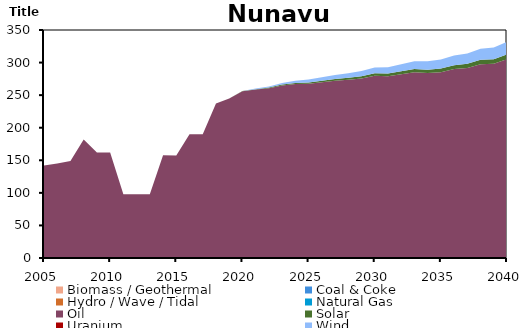
| Category | Biomass / Geothermal | Coal & Coke | Hydro / Wave / Tidal | Natural Gas | Oil | Solar | Uranium | Wind |
|---|---|---|---|---|---|---|---|---|
| 2005.0 | 0 | 0 | 0 | 0 | 142 | 0 | 0 | 0 |
| 2006.0 | 0 | 0 | 0 | 0 | 145 | 0 | 0 | 0 |
| 2007.0 | 0 | 0 | 0 | 0 | 149 | 0 | 0 | 0 |
| 2008.0 | 0 | 0 | 0 | 0 | 182 | 0 | 0 | 0 |
| 2009.0 | 0 | 0 | 0 | 0 | 162 | 0 | 0 | 0 |
| 2010.0 | 0 | 0 | 0 | 0 | 162 | 0 | 0 | 0 |
| 2011.0 | 0 | 0 | 0 | 0 | 98 | 0 | 0 | 0 |
| 2012.0 | 0 | 0 | 0 | 0 | 98 | 0 | 0 | 0 |
| 2013.0 | 0 | 0 | 0 | 0 | 98 | 0 | 0 | 0 |
| 2014.0 | 0 | 0 | 0 | 0 | 157.598 | 0 | 0 | 0 |
| 2015.0 | 0 | 0 | 0 | 0 | 157.415 | 0 | 0 | 0 |
| 2016.0 | 0 | 0 | 0 | 0 | 189.829 | 0 | 0 | 0 |
| 2017.0 | 0 | 0 | 0 | 0 | 189.829 | 0 | 0 | 0 |
| 2018.0 | 0 | 0 | 0 | 0 | 237.248 | 0 | 0 | 0 |
| 2019.0 | 0 | 0 | 0 | 0 | 244.741 | 0 | 0 | 0 |
| 2020.0 | 0 | 0 | 0 | 0 | 255.859 | 0.35 | 0 | 0 |
| 2021.0 | 0 | 0 | 0 | 0 | 258.58 | 0.643 | 0 | 0.846 |
| 2022.0 | 0 | 0 | 0 | 0 | 260.719 | 0.956 | 0 | 1.672 |
| 2023.0 | 0 | 0 | 0 | 0 | 264.931 | 1.292 | 0 | 2.562 |
| 2024.0 | 0 | 0 | 0 | 0 | 267.011 | 1.634 | 0 | 3.462 |
| 2025.0 | 0 | 0 | 0 | 0 | 267.531 | 1.974 | 0 | 4.357 |
| 2026.0 | 0 | 0 | 0 | 0 | 269.952 | 2.321 | 0 | 5.272 |
| 2027.0 | 0 | 0 | 0 | 0 | 272.148 | 2.666 | 0 | 6.184 |
| 2028.0 | 0 | 0 | 0 | 0 | 273.535 | 3.019 | 0 | 7.116 |
| 2029.0 | 0 | 0 | 0 | 0 | 275.73 | 3.369 | 0 | 8.04 |
| 2030.0 | 0 | 0 | 0 | 0 | 279.716 | 3.729 | 0 | 8.986 |
| 2031.0 | 0 | 0 | 0 | 0 | 278.967 | 4.091 | 0 | 9.942 |
| 2032.0 | 0 | 0 | 0 | 0 | 282.137 | 4.462 | 0 | 10.921 |
| 2033.0 | 0 | 0 | 0 | 0 | 285.296 | 4.832 | 0 | 11.895 |
| 2034.0 | 0 | 0 | 0 | 0 | 283.836 | 5.21 | 0 | 12.89 |
| 2035.0 | 0 | 0 | 0 | 0 | 285.226 | 5.587 | 0 | 13.881 |
| 2036.0 | 0 | 0 | 0 | 0 | 290.049 | 5.967 | 0 | 14.899 |
| 2037.0 | 0 | 0 | 0 | 0 | 291.803 | 6.353 | 0 | 15.912 |
| 2038.0 | 0 | 0 | 0 | 0 | 297.483 | 6.745 | 0 | 16.938 |
| 2039.0 | 0 | 0 | 0 | 0 | 298.036 | 7.147 | 0 | 17.995 |
| 2040.0 | 0 | 0 | 0 | 0 | 305.189 | 7.555 | 0 | 19.063 |